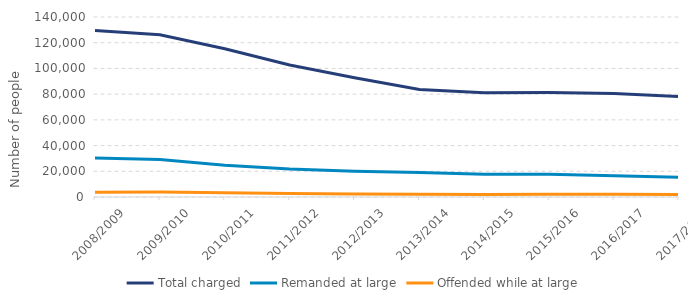
| Category | Total charged | Remanded at large | Offended while at large |
|---|---|---|---|
| 2008/2009 | 129574 | 30289 | 3682 |
| 2009/2010 | 126189 | 29075 | 3875 |
| 2010/2011 | 115264 | 24684 | 3233 |
| 2011/2012 | 102711 | 21713 | 2632 |
| 2012/2013 | 92681 | 20062 | 2264 |
| 2013/2014 | 83619 | 19142 | 2115 |
| 2014/2015 | 81113 | 17656 | 2031 |
| 2015/2016 | 81364 | 17762 | 2155 |
| 2016/2017 | 80531 | 16608 | 2143 |
| 2017/2018 | 78100 | 15400 | 1874 |